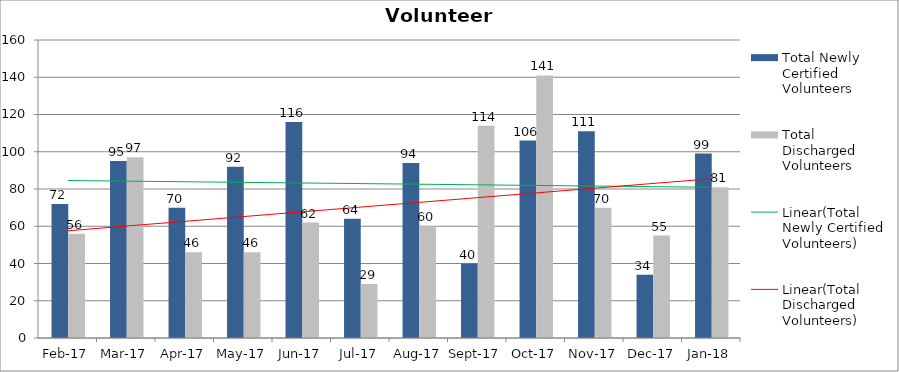
| Category | Total Newly Certified Volunteers | Total Discharged Volunteers |
|---|---|---|
| 2017-02-01 | 72 | 56 |
| 2017-03-01 | 95 | 97 |
| 2017-04-01 | 70 | 46 |
| 2017-05-01 | 92 | 46 |
| 2017-06-01 | 116 | 62 |
| 2017-07-01 | 64 | 29 |
| 2017-08-01 | 94 | 60 |
| 2017-09-01 | 40 | 114 |
| 2017-10-01 | 106 | 141 |
| 2017-11-01 | 111 | 70 |
| 2017-12-01 | 34 | 55 |
| 2018-01-01 | 99 | 81 |